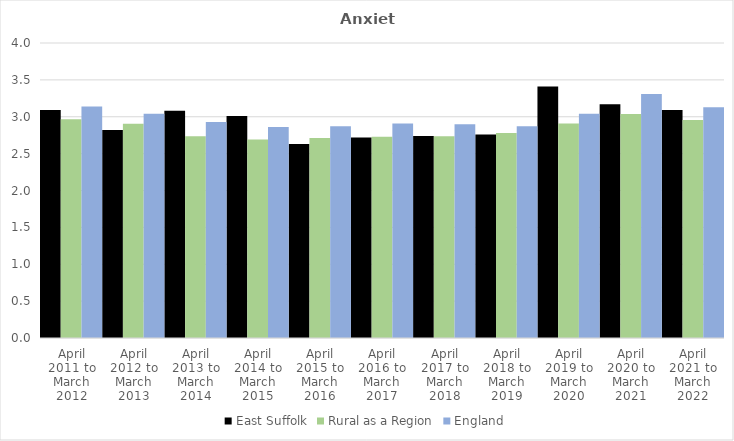
| Category | East Suffolk | Rural as a Region | England |
|---|---|---|---|
| April 2011 to March 2012 | 3.09 | 2.967 | 3.14 |
| April 2012 to March 2013 | 2.82 | 2.904 | 3.04 |
| April 2013 to March 2014 | 3.08 | 2.734 | 2.93 |
| April 2014 to March 2015 | 3.01 | 2.691 | 2.86 |
| April 2015 to March 2016 | 2.63 | 2.711 | 2.87 |
| April 2016 to March 2017 | 2.72 | 2.729 | 2.91 |
| April 2017 to March 2018 | 2.74 | 2.736 | 2.9 |
| April 2018 to March 2019 | 2.76 | 2.78 | 2.87 |
| April 2019 to March 2020 | 3.41 | 2.908 | 3.04 |
| April 2020 to March 2021 | 3.17 | 3.036 | 3.31 |
| April 2021 to March 2022 | 3.09 | 2.956 | 3.13 |